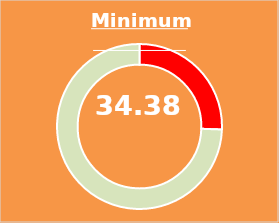
| Category | Series 0 |
|---|---|
| 0 | 4125.83 |
| 1 | 12000.026 |